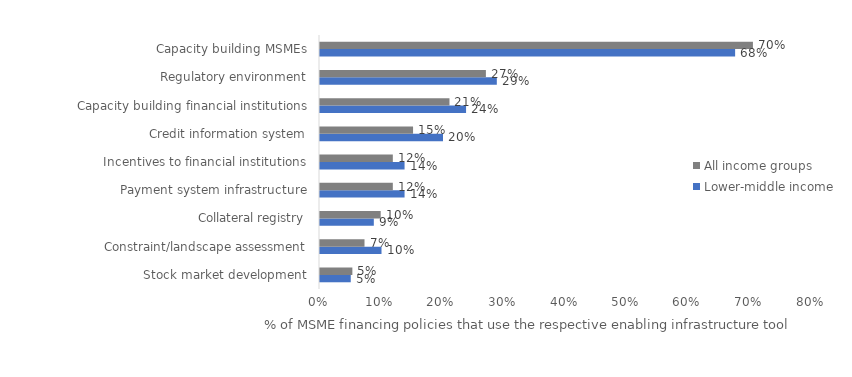
| Category | Lower-middle income | All income groups |
|---|---|---|
| Stock market development | 0.05 | 0.053 |
| Constraint/landscape assessment | 0.1 | 0.072 |
| Collateral registry | 0.088 | 0.099 |
| Payment system infrastructure | 0.138 | 0.118 |
| Incentives to financial institutions | 0.138 | 0.118 |
| Credit information system | 0.2 | 0.151 |
| Capacity building financial institutions | 0.238 | 0.211 |
| Regulatory environment | 0.288 | 0.27 |
| Capacity building MSMEs | 0.675 | 0.704 |